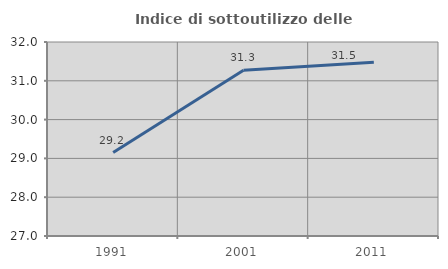
| Category | Indice di sottoutilizzo delle abitazioni  |
|---|---|
| 1991.0 | 29.151 |
| 2001.0 | 31.27 |
| 2011.0 | 31.475 |